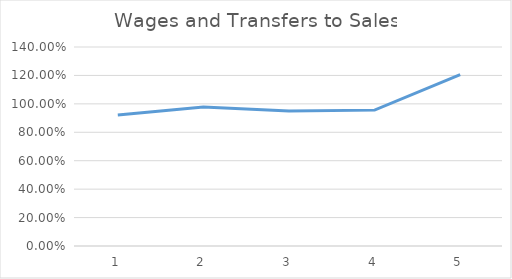
| Category | Series 0 |
|---|---|
| 0 | 0.922 |
| 1 | 0.978 |
| 2 | 0.951 |
| 3 | 0.956 |
| 4 | 1.206 |